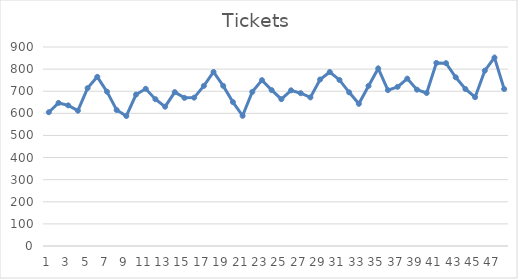
| Category | Tickets |
|---|---|
| 0 | 605 |
| 1 | 647 |
| 2 | 636 |
| 3 | 612 |
| 4 | 714 |
| 5 | 765 |
| 6 | 698 |
| 7 | 615 |
| 8 | 588 |
| 9 | 685 |
| 10 | 711 |
| 11 | 664 |
| 12 | 630 |
| 13 | 696 |
| 14 | 670 |
| 15 | 671 |
| 16 | 724 |
| 17 | 787 |
| 18 | 724 |
| 19 | 651 |
| 20 | 589 |
| 21 | 697 |
| 22 | 750 |
| 23 | 705 |
| 24 | 664 |
| 25 | 704 |
| 26 | 691 |
| 27 | 672 |
| 28 | 753 |
| 29 | 787 |
| 30 | 751 |
| 31 | 695 |
| 32 | 643 |
| 33 | 724 |
| 34 | 803 |
| 35 | 705 |
| 36 | 720 |
| 37 | 757 |
| 38 | 707 |
| 39 | 692 |
| 40 | 828 |
| 41 | 827 |
| 42 | 763 |
| 43 | 710 |
| 44 | 673 |
| 45 | 793 |
| 46 | 852 |
| 47 | 710 |